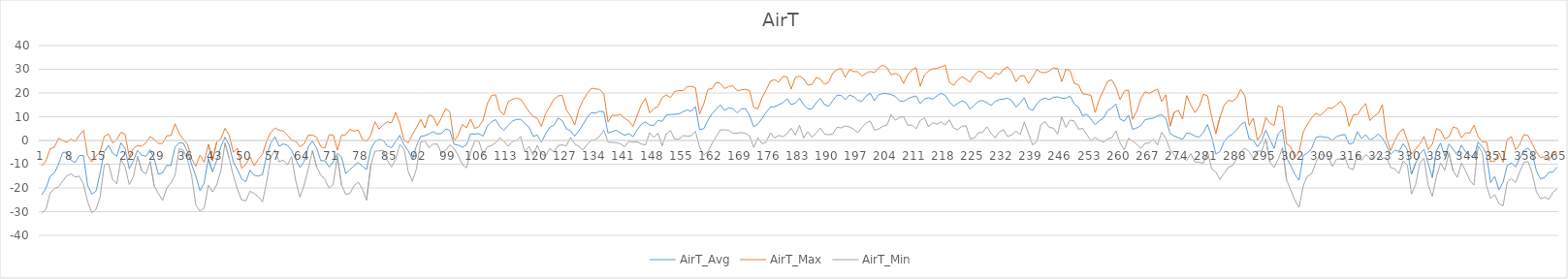
| Category | AirT_Avg | AirT_Max | AirT_Min |
|---|---|---|---|
| 0 | -22.84 | -10.69 | -30.61 |
| 1 | -20.05 | -8.59 | -28.93 |
| 2 | -15.02 | -3.44 | -22.11 |
| 3 | -13.74 | -2.92 | -20.33 |
| 4 | -10.08 | 0.89 | -19.59 |
| 5 | -5.06 | -0.03 | -17.17 |
| 6 | -4.92 | -0.86 | -14.88 |
| 7 | -8.28 | 0.59 | -14.07 |
| 8 | -9.34 | -0.46 | -15.36 |
| 9 | -6.34 | 2.21 | -15.02 |
| 10 | -6.32 | 4.27 | -18.36 |
| 11 | -18.97 | -6.32 | -25.79 |
| 12 | -22.57 | -9.05 | -30.47 |
| 13 | -21.42 | -6.59 | -29.07 |
| 14 | -13.79 | -4.81 | -23.81 |
| 15 | -4.77 | 1.75 | -10.39 |
| 16 | -2.02 | 2.71 | -9.75 |
| 17 | -5.35 | -1.06 | -16.39 |
| 18 | -6.65 | 0.39 | -18.29 |
| 19 | -1 | 3.39 | -8.05 |
| 20 | -3.39 | 2.64 | -11.14 |
| 21 | -11.96 | -6.88 | -18.57 |
| 22 | -8.52 | -3.38 | -15.22 |
| 23 | -4.19 | -2.06 | -6.72 |
| 24 | -6.21 | -2.5 | -12.81 |
| 25 | -6.7 | -0.94 | -14.1 |
| 26 | -3.88 | 1.58 | -8.89 |
| 27 | -7.82 | 0.49 | -19.25 |
| 28 | -14.3 | -1.27 | -22.32 |
| 29 | -13.6 | -1.28 | -25.24 |
| 30 | -10.46 | 1.99 | -20.14 |
| 31 | -10.58 | 2.06 | -17.88 |
| 32 | -2.76 | 7.03 | -14.61 |
| 33 | -1.02 | 2.94 | -3.46 |
| 34 | -1.11 | 0.39 | -4.13 |
| 35 | -4.81 | -1.64 | -8.04 |
| 36 | -10.19 | -7.81 | -15.02 |
| 37 | -15.05 | -10.87 | -27.16 |
| 38 | -21.17 | -6.17 | -29.78 |
| 39 | -17.93 | -9.21 | -28.52 |
| 40 | -7.63 | -1.62 | -18.84 |
| 41 | -13.17 | -8.52 | -21.71 |
| 42 | -8.47 | -0.67 | -18.77 |
| 43 | -2.62 | 0.73 | -12.74 |
| 44 | 1.37 | 5.12 | -1.1 |
| 45 | -2 | 2.29 | -7.47 |
| 46 | -9.06 | -4.98 | -14.82 |
| 47 | -12.29 | -3.32 | -20.61 |
| 48 | -16.18 | -11.76 | -25.04 |
| 49 | -17.42 | -10.02 | -25.45 |
| 50 | -12.48 | -6.86 | -21.37 |
| 51 | -14.63 | -10.63 | -22.32 |
| 52 | -15.02 | -7.88 | -23.64 |
| 53 | -14.33 | -5.77 | -25.86 |
| 54 | -6.49 | -0.33 | -17.47 |
| 55 | -1.07 | 3.44 | -7.16 |
| 56 | 1.56 | 5.24 | -3.93 |
| 57 | -2.45 | 4.27 | -9.03 |
| 58 | -1.43 | 3.99 | -8.24 |
| 59 | -2.03 | 2.26 | -10.29 |
| 60 | -4.19 | 0.05 | -6.72 |
| 61 | -8.05 | -0.33 | -17.1 |
| 62 | -11.36 | -2.68 | -23.88 |
| 63 | -8.95 | -1.42 | -18.84 |
| 64 | -2.66 | 2.22 | -11.97 |
| 65 | -0.28 | 2.31 | -4.2 |
| 66 | -3.15 | 1.33 | -11.08 |
| 67 | -8.53 | -2.58 | -14.58 |
| 68 | -8.51 | -3.26 | -16.45 |
| 69 | -11.24 | 2.38 | -20.1 |
| 70 | -8.91 | 2.26 | -18.53 |
| 71 | -5.54 | -4.06 | -6.58 |
| 72 | -7.01 | 2.24 | -18.77 |
| 73 | -13.95 | 2.39 | -22.72 |
| 74 | -12.33 | 4.74 | -22.34 |
| 75 | -10.71 | 3.91 | -19.11 |
| 76 | -9.26 | 4.42 | -17.47 |
| 77 | -10.86 | 0.49 | -20.44 |
| 78 | -12.28 | -0.38 | -25.11 |
| 79 | -3.77 | 2.19 | -10.59 |
| 80 | -0.65 | 7.89 | -4.51 |
| 81 | 0.49 | 4.84 | -4.38 |
| 82 | 0.03 | 6.56 | -4.27 |
| 83 | -2.35 | 7.9 | -8.42 |
| 84 | -3.06 | 7.42 | -11.17 |
| 85 | -0.41 | 11.84 | -7.87 |
| 86 | 2.18 | 7.04 | -1.65 |
| 87 | -1.92 | 0.04 | -3.72 |
| 88 | -4.31 | -1.02 | -12.91 |
| 89 | -7.98 | 2.52 | -17.27 |
| 90 | -2.2 | 5.48 | -11.89 |
| 91 | 1.7 | 8.91 | -0.67 |
| 92 | 2.03 | 5.34 | -0.19 |
| 93 | 2.75 | 10.78 | -3.08 |
| 94 | 3.71 | 10.08 | -1.55 |
| 95 | 2.75 | 6.26 | -1.51 |
| 96 | 2.92 | 9.57 | -5.49 |
| 97 | 4.87 | 13.37 | -4.1 |
| 98 | 4.31 | 12.12 | -1.83 |
| 99 | -1.59 | -0.19 | -3.32 |
| 100 | -1.95 | 2.12 | -6.24 |
| 101 | -2.82 | 6.72 | -10.13 |
| 102 | -1.81 | 5.34 | -11.56 |
| 103 | 2.82 | 9.03 | -4.84 |
| 104 | 2.68 | 5.05 | -0.12 |
| 105 | 2.86 | 5.9 | -0.39 |
| 106 | 1.81 | 8.61 | -5.83 |
| 107 | 6.06 | 15.47 | -2.77 |
| 108 | 7.9 | 18.91 | -2.09 |
| 109 | 8.77 | 19.26 | -1.03 |
| 110 | 5.84 | 12.52 | 1.14 |
| 111 | 4.28 | 10.69 | -0.36 |
| 112 | 6.29 | 16.29 | -2.43 |
| 113 | 8.14 | 17.34 | -0.5 |
| 114 | 8.89 | 17.76 | -0.06 |
| 115 | 8.88 | 17.46 | 1.65 |
| 116 | 7.15 | 14.93 | -4.74 |
| 117 | 5.7 | 12.18 | -2.51 |
| 118 | 1.73 | 10.21 | -6.23 |
| 119 | 2.31 | 9.33 | -2.12 |
| 120 | -0.76 | 5.9 | -5.76 |
| 121 | 2.75 | 11.23 | -6.64 |
| 122 | 5.52 | 14.22 | -3.38 |
| 123 | 6.39 | 17.35 | -4.88 |
| 124 | 9.48 | 18.78 | -2.13 |
| 125 | 8.36 | 18.98 | -1.85 |
| 126 | 4.9 | 12.93 | -2.26 |
| 127 | 4.1 | 10.38 | 1.31 |
| 128 | 1.8 | 6.51 | -1.47 |
| 129 | 4.04 | 13.12 | -2.53 |
| 130 | 6.77 | 16.94 | -3.99 |
| 131 | 9.7 | 19.84 | -1.58 |
| 132 | 11.73 | 22.03 | 0.05 |
| 133 | 11.51 | 21.74 | 0.36 |
| 134 | 12.32 | 21.5 | 1.78 |
| 135 | 12.01 | 19.6 | 4.37 |
| 136 | 3.09 | 7.76 | -0.73 |
| 137 | 3.78 | 10.66 | -0.84 |
| 138 | 4.3 | 10.59 | -0.93 |
| 139 | 3.16 | 10.96 | -1.41 |
| 140 | 2.2 | 9.29 | -2.63 |
| 141 | 2.89 | 8.21 | -0.33 |
| 142 | 1.58 | 5.9 | -0.67 |
| 143 | 4.52 | 10.58 | -0.6 |
| 144 | 6.81 | 15.11 | -1.48 |
| 145 | 7.83 | 17.76 | -1.92 |
| 146 | 6.5 | 11.64 | 3.28 |
| 147 | 6.34 | 13.41 | 1.27 |
| 148 | 8.5 | 14.29 | 3.11 |
| 149 | 7.98 | 18.03 | -2.29 |
| 150 | 10.67 | 19.24 | 2.84 |
| 151 | 10.94 | 18.03 | 4.17 |
| 152 | 11.03 | 20.6 | 0.56 |
| 153 | 11.2 | 21.01 | 0.49 |
| 154 | 12.11 | 20.94 | 2.06 |
| 155 | 12.86 | 22.64 | 1.82 |
| 156 | 12.29 | 22.84 | 1.99 |
| 157 | 14.29 | 22.28 | 3.85 |
| 158 | 4.58 | 11.03 | -2.78 |
| 159 | 4.96 | 15.44 | -6.03 |
| 160 | 8.52 | 21.53 | -4.74 |
| 161 | 11.27 | 21.79 | -1.24 |
| 162 | 13.21 | 24.54 | 1.75 |
| 163 | 15.01 | 24 | 4.47 |
| 164 | 12.68 | 21.88 | 4.46 |
| 165 | 13.75 | 22.71 | 4.3 |
| 166 | 13.45 | 23.04 | 3.01 |
| 167 | 11.59 | 21.01 | 3.04 |
| 168 | 13.31 | 21.28 | 3.34 |
| 169 | 13.44 | 21.58 | 2.97 |
| 170 | 10.57 | 21.03 | 1.99 |
| 171 | 5.74 | 13.94 | -2.94 |
| 172 | 6.94 | 13.34 | 1.11 |
| 173 | 9.25 | 18.03 | -1.37 |
| 174 | 11.89 | 21.28 | -0.67 |
| 175 | 14.09 | 24.96 | 3.21 |
| 176 | 14.21 | 25.63 | 1.07 |
| 177 | 15.08 | 24.58 | 2.13 |
| 178 | 15.86 | 26.94 | 1.58 |
| 179 | 17.63 | 26.83 | 2.83 |
| 180 | 15.11 | 21.58 | 5.15 |
| 181 | 15.75 | 26.59 | 2.29 |
| 182 | 17.75 | 27.17 | 6.4 |
| 183 | 15.1 | 26.01 | 1.07 |
| 184 | 13.28 | 23.28 | 3.69 |
| 185 | 13.31 | 23.56 | 1.38 |
| 186 | 15.88 | 26.52 | 3.21 |
| 187 | 17.72 | 25.91 | 5.28 |
| 188 | 15.12 | 23.66 | 2.73 |
| 189 | 14.43 | 24.61 | 2.36 |
| 190 | 16.84 | 28.44 | 2.8 |
| 191 | 19.09 | 29.83 | 5.56 |
| 192 | 18.98 | 30.33 | 5.29 |
| 193 | 17.15 | 26.59 | 6.2 |
| 194 | 19.13 | 29.83 | 5.66 |
| 195 | 18.47 | 29.06 | 4.77 |
| 196 | 16.87 | 28.94 | 3.24 |
| 197 | 16.51 | 27.11 | 5.59 |
| 198 | 18.76 | 28.33 | 7.28 |
| 199 | 19.91 | 29.06 | 8.2 |
| 200 | 16.71 | 28.61 | 4.33 |
| 201 | 19.26 | 30.56 | 4.81 |
| 202 | 19.76 | 31.83 | 6 |
| 203 | 19.72 | 30.72 | 6.41 |
| 204 | 19.38 | 27.67 | 10.84 |
| 205 | 18.56 | 28.28 | 8.55 |
| 206 | 16.67 | 27.44 | 9.6 |
| 207 | 16.44 | 24 | 10.07 |
| 208 | 17.56 | 27.72 | 6.37 |
| 209 | 18.31 | 29.72 | 6.47 |
| 210 | 18.77 | 30.67 | 4.88 |
| 211 | 15.58 | 22.87 | 8.41 |
| 212 | 17.44 | 27.5 | 9.56 |
| 213 | 18.01 | 29.33 | 5.73 |
| 214 | 17.41 | 30.11 | 7.56 |
| 215 | 18.78 | 30.44 | 6.82 |
| 216 | 19.86 | 31 | 7.82 |
| 217 | 19.03 | 31.78 | 6.58 |
| 218 | 16.22 | 24.5 | 8.72 |
| 219 | 14.49 | 23.18 | 5.26 |
| 220 | 15.53 | 25.5 | 4.51 |
| 221 | 16.74 | 26.89 | 6 |
| 222 | 15.88 | 25.84 | 6.23 |
| 223 | 13.11 | 24.61 | 0.69 |
| 224 | 14.92 | 27.56 | 1.07 |
| 225 | 16.48 | 29.17 | 3.28 |
| 226 | 16.83 | 28.78 | 3.42 |
| 227 | 15.9 | 26.66 | 5.79 |
| 228 | 14.75 | 26.04 | 3.07 |
| 229 | 16.46 | 28.5 | 1.11 |
| 230 | 17.21 | 27.83 | 3.61 |
| 231 | 17.43 | 29.94 | 4.57 |
| 232 | 17.85 | 31 | 1.64 |
| 233 | 16.79 | 28.89 | 2.36 |
| 234 | 14.1 | 24.78 | 3.96 |
| 235 | 15.72 | 27.22 | 2.47 |
| 236 | 18.02 | 27.28 | 7.66 |
| 237 | 13.59 | 24 | 3.01 |
| 238 | 12.63 | 26.78 | -1.92 |
| 239 | 15.42 | 29.83 | -0.46 |
| 240 | 17.28 | 28.72 | 6.78 |
| 241 | 17.83 | 28.56 | 7.93 |
| 242 | 17.18 | 29.28 | 5.46 |
| 243 | 18.18 | 30.61 | 5.23 |
| 244 | 18.35 | 30.28 | 2.63 |
| 245 | 17.8 | 24.77 | 9.93 |
| 246 | 17.78 | 30.11 | 5.47 |
| 247 | 18.7 | 29.28 | 8.57 |
| 248 | 15.32 | 24.09 | 8.23 |
| 249 | 14.07 | 23.47 | 4.75 |
| 250 | 10.36 | 19.71 | 5.11 |
| 251 | 11.08 | 19.38 | 2.51 |
| 252 | 8.98 | 19.02 | -0.12 |
| 253 | 6.67 | 11.78 | 1.24 |
| 254 | 8.25 | 17.28 | 0.1 |
| 255 | 9.43 | 21.05 | -0.73 |
| 256 | 12.59 | 24.91 | 0.64 |
| 257 | 13.73 | 25.54 | 1.16 |
| 258 | 15.33 | 22.46 | 4.1 |
| 259 | 9.07 | 17.21 | -0.97 |
| 260 | 8.05 | 20.76 | -3.99 |
| 261 | 10.67 | 21.27 | 0.87 |
| 262 | 4.67 | 8.91 | -0.16 |
| 263 | 5.29 | 12.3 | -1.56 |
| 264 | 6.22 | 17.63 | -3.41 |
| 265 | 8.74 | 20.51 | -1.21 |
| 266 | 9.11 | 19.89 | -1.06 |
| 267 | 9.41 | 20.82 | 0.57 |
| 268 | 10.43 | 21.58 | -1.9 |
| 269 | 10.8 | 16.37 | 3.44 |
| 270 | 9.26 | 19.27 | 0.89 |
| 271 | 2.98 | 5.99 | -3.9 |
| 272 | 1.88 | 11.87 | -6.18 |
| 273 | 1.19 | 12.71 | -8.11 |
| 274 | 0.47 | 9.02 | -7.13 |
| 275 | 3.09 | 18.93 | -8.37 |
| 276 | 2.85 | 14.81 | -5.56 |
| 277 | 1.78 | 11.75 | -9.16 |
| 278 | 1.46 | 14.27 | -9.14 |
| 279 | 3.2 | 19.46 | -9.58 |
| 280 | 6.73 | 18.81 | -4.64 |
| 281 | 1.57 | 9.96 | -11.97 |
| 282 | -5.69 | 2.94 | -13.27 |
| 283 | -4.66 | 9.8 | -16.44 |
| 284 | -0.49 | 14.83 | -13.81 |
| 285 | 1.63 | 16.88 | -11.37 |
| 286 | 2.63 | 16.5 | -10.59 |
| 287 | 4.39 | 17.93 | -7.65 |
| 288 | 6.66 | 21.46 | -4.78 |
| 289 | 7.78 | 18.79 | -3.22 |
| 290 | 0.64 | 6.32 | -4.72 |
| 291 | 0.11 | 9.42 | -7.47 |
| 292 | -2.68 | 0.05 | -4.4 |
| 293 | -0.1 | 2.73 | -4.61 |
| 294 | 4.33 | 9.65 | 0.74 |
| 295 | 0.4 | 7.33 | -9.22 |
| 296 | -3.34 | 6.26 | -11.38 |
| 297 | 2.96 | 14.67 | -7.88 |
| 298 | 4.72 | 13.84 | -3.11 |
| 299 | -7.28 | -1.36 | -16.73 |
| 300 | -10.57 | -2.68 | -20.83 |
| 301 | -14.34 | -7.11 | -25.24 |
| 302 | -16.77 | -4.84 | -28.22 |
| 303 | -6.34 | 3.62 | -19.02 |
| 304 | -5.29 | 6.7 | -15.03 |
| 305 | -3.49 | 9.45 | -14.12 |
| 306 | 1.17 | 11.54 | -9.51 |
| 307 | 1.72 | 10.49 | -5.9 |
| 308 | 1.41 | 11.89 | -6.21 |
| 309 | 1.19 | 13.82 | -7.06 |
| 310 | 0.01 | 13.46 | -10.98 |
| 311 | 1.62 | 14.97 | -7.84 |
| 312 | 2.19 | 16.56 | -7.91 |
| 313 | 2.54 | 13.81 | -7.16 |
| 314 | -1.5 | 6.01 | -11.61 |
| 315 | -1.02 | 10.77 | -12.32 |
| 316 | 3.72 | 10.84 | -5.82 |
| 317 | 0.85 | 13.46 | -8.42 |
| 318 | 2.41 | 15.54 | -5.93 |
| 319 | 0.14 | 8.38 | -7.34 |
| 320 | 1.13 | 10.3 | -7.46 |
| 321 | 2.71 | 11.34 | -5.04 |
| 322 | 1.12 | 15.09 | -7.63 |
| 323 | -2.07 | 1 | -7.19 |
| 324 | -5.85 | -4.22 | -11.38 |
| 325 | -4.11 | 0.06 | -11.99 |
| 326 | -4.6 | 3.25 | -13.99 |
| 327 | -1.38 | 4.96 | -8.63 |
| 328 | -3.93 | 0.13 | -10.27 |
| 329 | -14.3 | -5.81 | -22.56 |
| 330 | -9.56 | -3.65 | -18.55 |
| 331 | -5.65 | -1.48 | -9.61 |
| 332 | -3.75 | 1.64 | -7.41 |
| 333 | -9.62 | -3.76 | -18.67 |
| 334 | -15.61 | -1.64 | -23.57 |
| 335 | -4.32 | 5.08 | -15.2 |
| 336 | -1.12 | 4.09 | -9.45 |
| 337 | -6.63 | 0.67 | -12.65 |
| 338 | -1.47 | 1.56 | -5.24 |
| 339 | -3.62 | 5.61 | -12.85 |
| 340 | -6.23 | 5.16 | -15.59 |
| 341 | -2.03 | 1.09 | -9.42 |
| 342 | -4.81 | 3.2 | -12.82 |
| 343 | -6.2 | 3.15 | -16.72 |
| 344 | -7.34 | 6.39 | -18.87 |
| 345 | -0.61 | 1.65 | -2.39 |
| 346 | -2.61 | -0.67 | -5.02 |
| 347 | -5.53 | -0.43 | -18.98 |
| 348 | -17.77 | -9.03 | -24.46 |
| 349 | -15.11 | -8.69 | -22.89 |
| 350 | -20.83 | -5.08 | -26.56 |
| 351 | -17.63 | -9.18 | -27.6 |
| 352 | -10.56 | 0.49 | -17.54 |
| 353 | -9.44 | 1.6 | -16.08 |
| 354 | -11.22 | -3.93 | -17.79 |
| 355 | -7.5 | -1.61 | -13.23 |
| 356 | -4.23 | 2.47 | -9.22 |
| 357 | -3.19 | 2.06 | -8.91 |
| 358 | -5.29 | -1.36 | -13.86 |
| 359 | -12.79 | -4.87 | -21.61 |
| 360 | -16.17 | -7.26 | -24.59 |
| 361 | -15.69 | -6.81 | -23.87 |
| 362 | -13.41 | -8.41 | -24.82 |
| 363 | -13.31 | -4.98 | -21.81 |
| 364 | -11.23 | -5.66 | -20.4 |